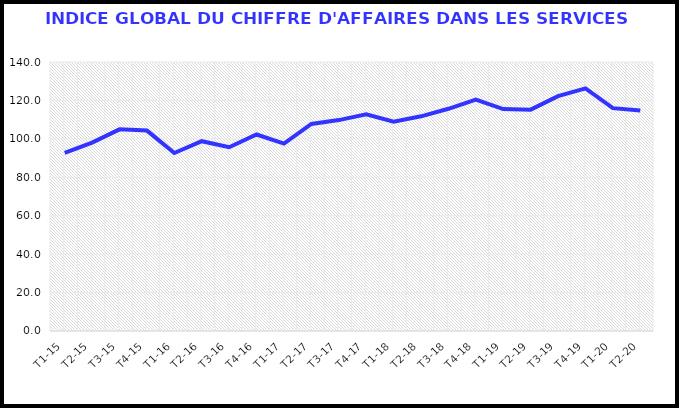
| Category | Series 0 |
|---|---|
| T1-15 | 92.699 |
| T2-15 | 98.05 |
| T3-15 | 104.944 |
| T4-15 | 104.307 |
| T1-16 | 92.641 |
| T2-16 | 98.793 |
| T3-16 | 95.621 |
| T4-16 | 102.268 |
| T1-17 | 97.533 |
| T2-17 | 107.776 |
| T3-17 | 109.762 |
| T4-17 | 112.778 |
| T1-18 | 108.879 |
| T2-18 | 111.737 |
| T3-18 | 115.647 |
| T4-18 | 120.487 |
| T1-19 | 115.492 |
| T2-19 | 115.195 |
| T3-19 | 122.213 |
| T4-19 | 126.283 |
| T1-20 | 115.981 |
| T2-20 | 114.701 |